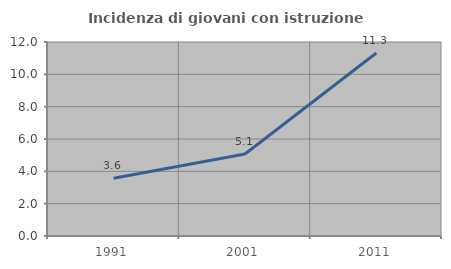
| Category | Incidenza di giovani con istruzione universitaria |
|---|---|
| 1991.0 | 3.571 |
| 2001.0 | 5.069 |
| 2011.0 | 11.321 |